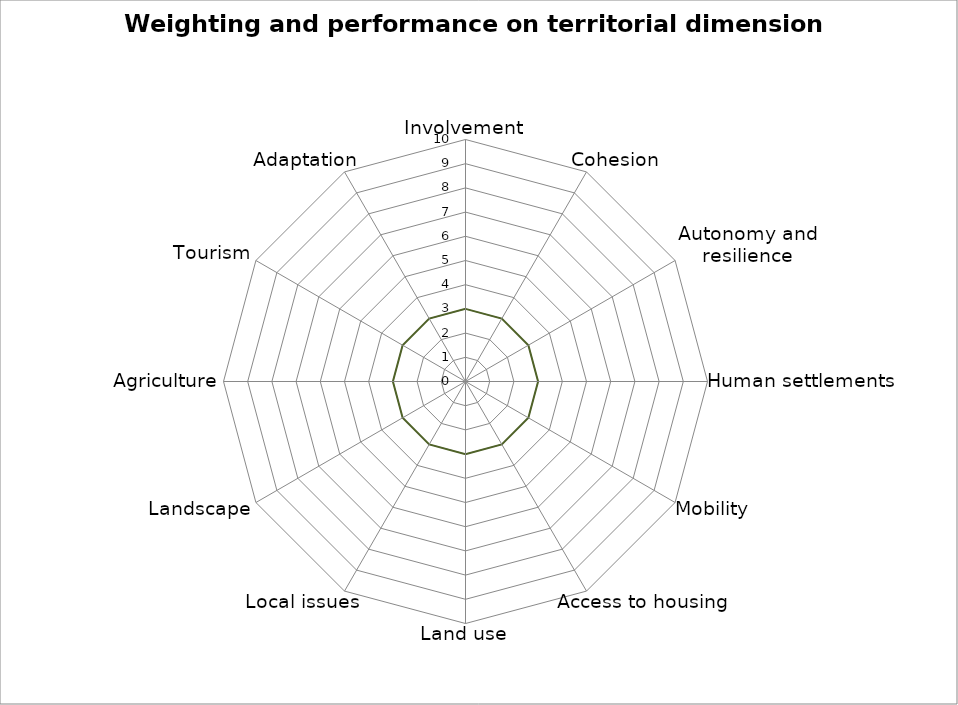
| Category | Performance | Weighting | Series 2 |
|---|---|---|---|
| Involvement | 0 | 0 | 3 |
| Cohesion | 0 | 0 | 3 |
| Autonomy and resilience | 0 | 0 | 3 |
| Human settlements | 0 | 0 | 3 |
| Mobility | 0 | 0 | 3 |
| Access to housing | 0 | 0 | 3 |
| Land use | 0 | 0 | 3 |
| Local issues | 0 | 0 | 3 |
| Landscape | 0 | 0 | 3 |
| Agriculture | 0 | 0 | 3 |
| Tourism | 0 | 0 | 3 |
| Adaptation | 0 | 0 | 3 |